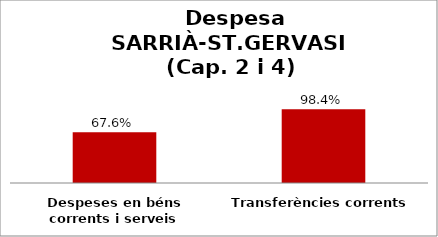
| Category | Series 0 |
|---|---|
| Despeses en béns corrents i serveis | 0.676 |
| Transferències corrents | 0.984 |